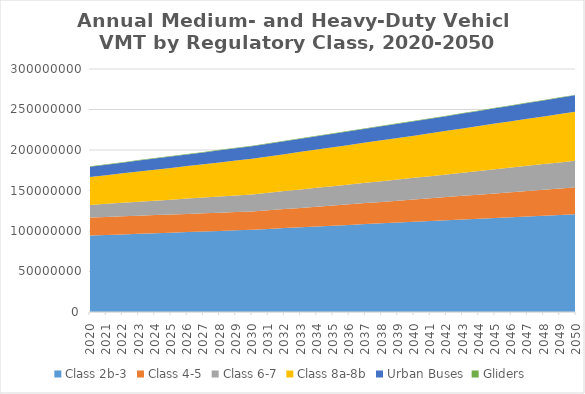
| Category | Class 2b-3 | Class 4-5 | Class 6-7 | Class 8a-8b | Urban Buses | Gliders |
|---|---|---|---|---|---|---|
| 2020.0 | 94314471.385 | 22291178.462 | 15613769.231 | 34412676.615 | 12701157.154 | 581833.231 |
| 2021.0 | 95042593.846 | 22315044.615 | 16157902.308 | 35373322.154 | 12974979.538 | 589707.308 |
| 2022.0 | 95770716.308 | 22338910.769 | 16702035.385 | 36333967.692 | 13248801.923 | 597581.385 |
| 2023.0 | 96498838.769 | 22362776.923 | 17246168.462 | 37294613.231 | 13522624.308 | 605455.462 |
| 2024.0 | 97226961.231 | 22386643.077 | 17790301.538 | 38255258.769 | 13796446.692 | 613329.538 |
| 2025.0 | 97955083.692 | 22410509.231 | 18334434.615 | 39215904.308 | 14070269.077 | 621203.615 |
| 2026.0 | 98683206.154 | 22434375.385 | 18878567.692 | 40176549.846 | 14344091.462 | 629077.692 |
| 2027.0 | 99411328.615 | 22458241.538 | 19422700.769 | 41137195.385 | 14617913.846 | 636951.769 |
| 2028.0 | 100139451.077 | 22482107.692 | 19966833.846 | 42097840.923 | 14891736.231 | 644825.846 |
| 2029.0 | 100867573.538 | 22505973.846 | 20510966.923 | 43058486.462 | 15165558.615 | 652699.923 |
| 2030.0 | 101595696 | 22529840 | 21055100 | 44019132 | 15439381 | 660574 |
| 2031.0 | 102583916 | 23014137 | 21624752 | 44829612 | 15657608.1 | 656427.8 |
| 2032.0 | 103572136 | 23498434 | 22194404 | 45640092 | 15875835.2 | 652281.6 |
| 2033.0 | 104560356 | 23982731 | 22764056 | 46450572 | 16094062.3 | 648135.4 |
| 2034.0 | 105548576 | 24467028 | 23333708 | 47261052 | 16312289.4 | 643989.2 |
| 2035.0 | 106536796 | 24951325 | 23903360 | 48071532 | 16530516.5 | 639843 |
| 2036.0 | 107525016 | 25435622 | 24473012 | 48882012 | 16748743.6 | 635696.8 |
| 2037.0 | 108513236 | 25919919 | 25042664 | 49692492 | 16966970.7 | 631550.6 |
| 2038.0 | 109501456 | 26404216 | 25612316 | 50502972 | 17185197.8 | 627404.4 |
| 2039.0 | 110489676 | 26888513 | 26181968 | 51313452 | 17403424.9 | 623258.2 |
| 2040.0 | 111477896 | 27372810 | 26751620 | 52123932 | 17621652 | 619112 |
| 2041.0 | 112398306.4 | 27962083 | 27365481 | 52972148.8 | 17879301.4 | 614950.5 |
| 2042.0 | 113318716.8 | 28551356 | 27979342 | 53820365.6 | 18136950.8 | 610789 |
| 2043.0 | 114239127.2 | 29140629 | 28593203 | 54668582.4 | 18394600.2 | 606627.5 |
| 2044.0 | 115159537.6 | 29729902 | 29207064 | 55516799.2 | 18652249.6 | 602466 |
| 2045.0 | 116079948 | 30319175 | 29820925 | 56365016 | 18909899 | 598304.5 |
| 2046.0 | 117000358.4 | 30908448 | 30434786 | 57213232.8 | 19167548.4 | 594143 |
| 2047.0 | 117920768.8 | 31497721 | 31048647 | 58061449.6 | 19425197.8 | 589981.5 |
| 2048.0 | 118841179.2 | 32086994 | 31662508 | 58909666.4 | 19682847.2 | 585820 |
| 2049.0 | 119761589.6 | 32676267 | 32276369 | 59757883.2 | 19940496.6 | 581658.5 |
| 2050.0 | 120682000 | 33265540 | 32890230 | 60606100 | 20198146 | 577497 |